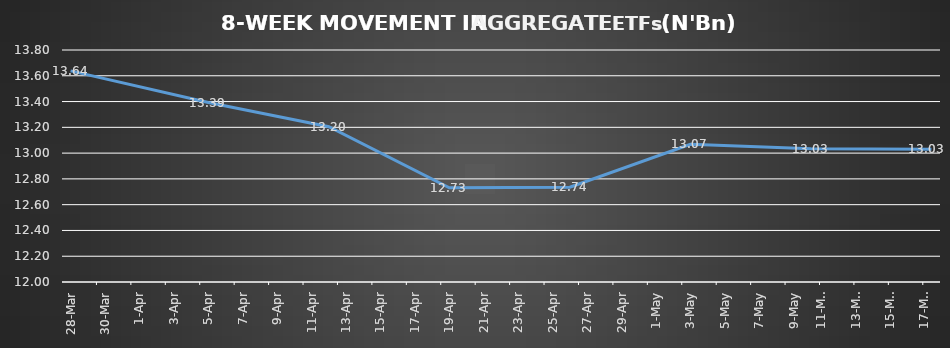
| Category | ETFs AGGREGATE |
|---|---|
| 2024-03-28 | 13.638 |
| 2024-04-05 | 13.392 |
| 2024-04-12 | 13.205 |
| 2024-04-19 | 12.73 |
| 2024-04-26 | 12.735 |
| 2024-05-03 | 13.068 |
| 2024-05-10 | 13.034 |
| 2024-05-17 | 13.03 |